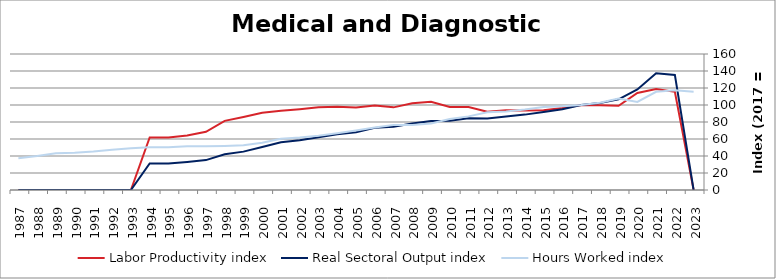
| Category | Labor Productivity index | Real Sectoral Output index | Hours Worked index |
|---|---|---|---|
| 2023.0 | 0 | 0 | 115.594 |
| 2022.0 | 115.508 | 135.404 | 117.225 |
| 2021.0 | 118.859 | 137.368 | 115.572 |
| 2020.0 | 114.195 | 118.279 | 103.576 |
| 2019.0 | 99.035 | 106.68 | 107.719 |
| 2018.0 | 99.627 | 102.229 | 102.612 |
| 2017.0 | 100 | 100 | 100 |
| 2016.0 | 96.425 | 95.071 | 98.595 |
| 2015.0 | 93.907 | 91.808 | 97.764 |
| 2014.0 | 93.612 | 88.682 | 94.734 |
| 2013.0 | 93.833 | 86.546 | 92.234 |
| 2012.0 | 92.032 | 84.24 | 91.533 |
| 2011.0 | 97.507 | 84.445 | 86.604 |
| 2010.0 | 97.59 | 81.565 | 83.579 |
| 2009.0 | 103.763 | 81.287 | 78.339 |
| 2008.0 | 102.167 | 78.188 | 76.53 |
| 2007.0 | 97.234 | 74.36 | 76.475 |
| 2006.0 | 99.267 | 73.09 | 73.63 |
| 2005.0 | 97.175 | 68.02 | 69.997 |
| 2004.0 | 97.99 | 65.51 | 66.853 |
| 2003.0 | 97.305 | 62.071 | 63.791 |
| 2002.0 | 94.995 | 58.64 | 61.73 |
| 2001.0 | 93.138 | 56.054 | 60.184 |
| 2000.0 | 90.917 | 50.491 | 55.536 |
| 1999.0 | 85.861 | 45.151 | 52.586 |
| 1998.0 | 81.306 | 42.115 | 51.798 |
| 1997.0 | 68.462 | 35.168 | 51.368 |
| 1996.0 | 64.215 | 32.997 | 51.385 |
| 1995.0 | 61.776 | 31.147 | 50.42 |
| 1994.0 | 61.863 | 31.17 | 50.386 |
| 1993.0 | 0 | 0 | 49.21 |
| 1992.0 | 0 | 0 | 47.361 |
| 1991.0 | 0 | 0 | 45.323 |
| 1990.0 | 0 | 0 | 43.959 |
| 1989.0 | 0 | 0 | 43.335 |
| 1988.0 | 0 | 0 | 39.951 |
| 1987.0 | 0 | 0 | 37.241 |